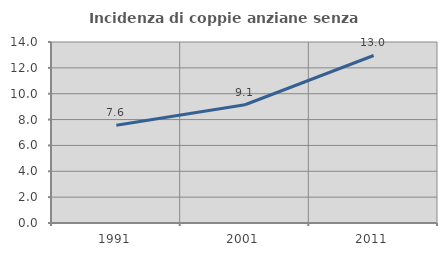
| Category | Incidenza di coppie anziane senza figli  |
|---|---|
| 1991.0 | 7.56 |
| 2001.0 | 9.148 |
| 2011.0 | 12.958 |